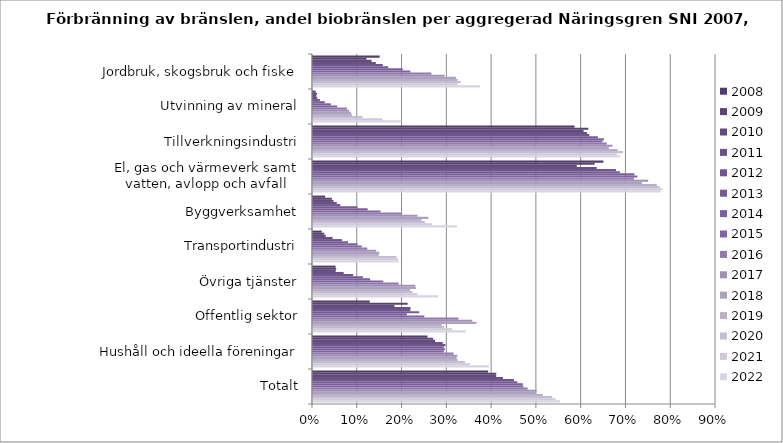
| Category | 2008 | 2009 | 2010 | 2011 | 2012 | 2013 | 2014 | 2015 | 2016 | 2017 | 2018 | 2019 | 2020 | 2021 | 2022 |
|---|---|---|---|---|---|---|---|---|---|---|---|---|---|---|---|
| Jordbruk, skogsbruk och fiske | 0.149 | 0.119 | 0.131 | 0.14 | 0.156 | 0.168 | 0.201 | 0.218 | 0.264 | 0.294 | 0.319 | 0.323 | 0.33 | 0.323 | 0.373 |
| Utvinning av mineral | 0.006 | 0.009 | 0.007 | 0.01 | 0.015 | 0.026 | 0.04 | 0.054 | 0.076 | 0.081 | 0.085 | 0.087 | 0.11 | 0.155 | 0.197 |
| Tillverkningsindustri | 0.584 | 0.615 | 0.604 | 0.612 | 0.617 | 0.636 | 0.65 | 0.646 | 0.656 | 0.669 | 0.661 | 0.68 | 0.692 | 0.678 | 0.686 |
| El, gas och värmeverk samt vatten, avlopp och avfall | 0.649 | 0.629 | 0.589 | 0.634 | 0.677 | 0.685 | 0.718 | 0.724 | 0.717 | 0.748 | 0.734 | 0.768 | 0.774 | 0.78 | 0.777 |
| Byggverksamhet | 0.027 | 0.042 | 0.046 | 0.053 | 0.061 | 0.099 | 0.122 | 0.151 | 0.197 | 0.233 | 0.257 | 0.242 | 0.25 | 0.265 | 0.322 |
| Transportindustri | 0.019 | 0.025 | 0.028 | 0.044 | 0.065 | 0.078 | 0.099 | 0.109 | 0.121 | 0.141 | 0.148 | 0.147 | 0.186 | 0.19 | 0.191 |
| Övriga tjänster | 0.05 | 0.052 | 0.051 | 0.069 | 0.09 | 0.111 | 0.127 | 0.157 | 0.191 | 0.228 | 0.23 | 0.217 | 0.222 | 0.233 | 0.28 |
| Offentlig sektor | 0.127 | 0.211 | 0.182 | 0.218 | 0.217 | 0.237 | 0.21 | 0.249 | 0.325 | 0.356 | 0.365 | 0.288 | 0.293 | 0.311 | 0.341 |
| Hushåll och ideella föreningar | 0.256 | 0.268 | 0.273 | 0.29 | 0.296 | 0.292 | 0.294 | 0.292 | 0.314 | 0.323 | 0.321 | 0.323 | 0.339 | 0.351 | 0.393 |
| Totalt | 0.391 | 0.409 | 0.409 | 0.424 | 0.449 | 0.457 | 0.469 | 0.47 | 0.479 | 0.499 | 0.499 | 0.513 | 0.534 | 0.542 | 0.551 |